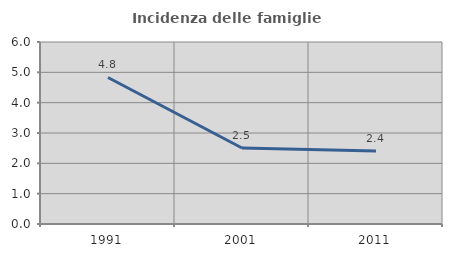
| Category | Incidenza delle famiglie numerose |
|---|---|
| 1991.0 | 4.831 |
| 2001.0 | 2.505 |
| 2011.0 | 2.407 |